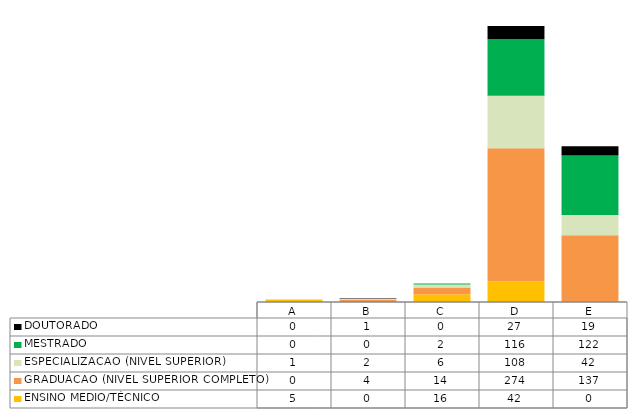
| Category | ENSINO MEDIO/TÉCNICO | GRADUACAO (NIVEL SUPERIOR COMPLETO) | ESPECIALIZACAO (NIVEL SUPERIOR) | MESTRADO | DOUTORADO |
|---|---|---|---|---|---|
| A | 5 | 0 | 1 | 0 | 0 |
| B | 0 | 4 | 2 | 0 | 1 |
| C | 16 | 14 | 6 | 2 | 0 |
| D | 42 | 274 | 108 | 116 | 27 |
| E | 0 | 137 | 42 | 122 | 19 |